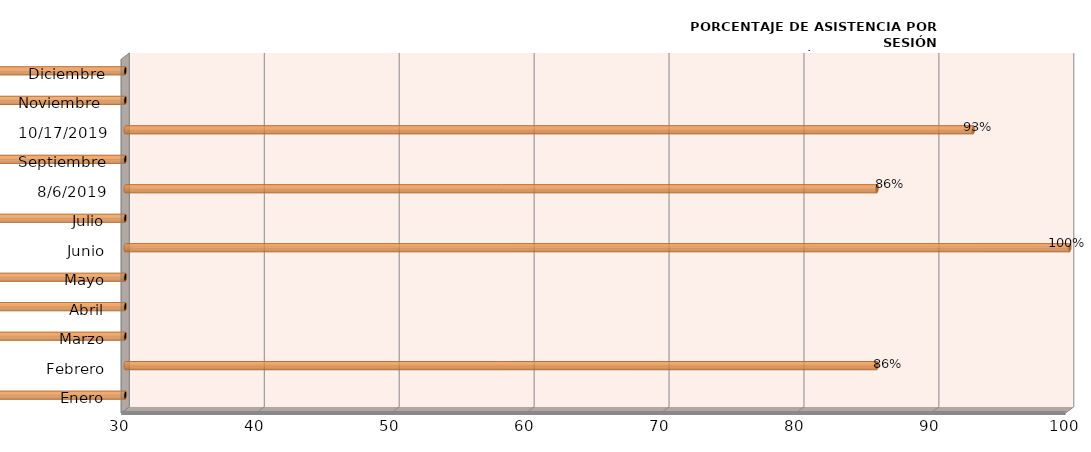
| Category | Series 0 |
|---|---|
| Enero | 0 |
| Febrero | 85.714 |
| Marzo | 0 |
| Abril | 0 |
| Mayo | 0 |
| Junio | 100 |
| Julio | 0 |
| 06/08/2019 | 85.714 |
| Septiembre | 0 |
| 17/10/2019 | 92.857 |
| Noviembre  | 0 |
| Diciembre | 0 |